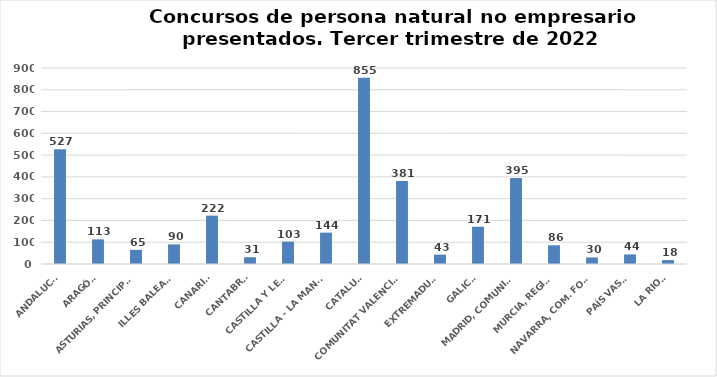
| Category | Series 0 |
|---|---|
| ANDALUCÍA | 527 |
| ARAGÓN | 113 |
| ASTURIAS, PRINCIPADO | 65 |
| ILLES BALEARS | 90 |
| CANARIAS | 222 |
| CANTABRIA | 31 |
| CASTILLA Y LEÓN | 103 |
| CASTILLA - LA MANCHA | 144 |
| CATALUÑA | 855 |
| COMUNITAT VALENCIANA | 381 |
| EXTREMADURA | 43 |
| GALICIA | 171 |
| MADRID, COMUNIDAD | 395 |
| MURCIA, REGIÓN | 86 |
| NAVARRA, COM. FORAL | 30 |
| PAÍS VASCO | 44 |
| LA RIOJA | 18 |